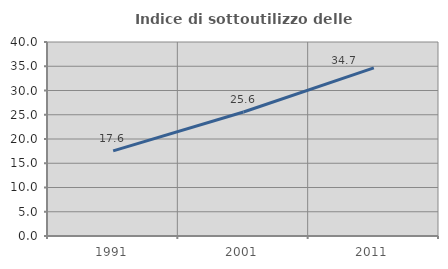
| Category | Indice di sottoutilizzo delle abitazioni  |
|---|---|
| 1991.0 | 17.564 |
| 2001.0 | 25.565 |
| 2011.0 | 34.677 |